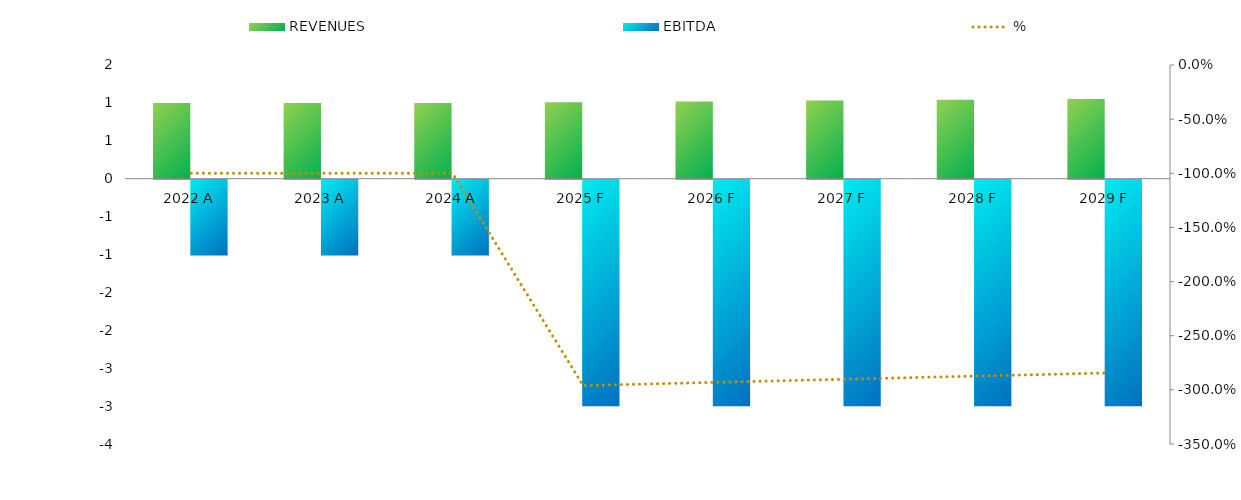
| Category | REVENUES | EBITDA |
|---|---|---|
| 2022.0 | 1 | -1 |
| 2023.0 | 1 | -1 |
| 2024.0 | 1 | -1 |
| 2025.0 | 1.01 | -2.99 |
| 2026.0 | 1.02 | -2.99 |
| 2027.0 | 1.03 | -2.99 |
| 2028.0 | 1.041 | -2.99 |
| 2029.0 | 1.051 | -2.989 |